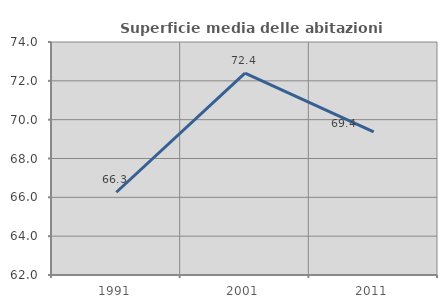
| Category | Superficie media delle abitazioni occupate |
|---|---|
| 1991.0 | 66.262 |
| 2001.0 | 72.395 |
| 2011.0 | 69.37 |